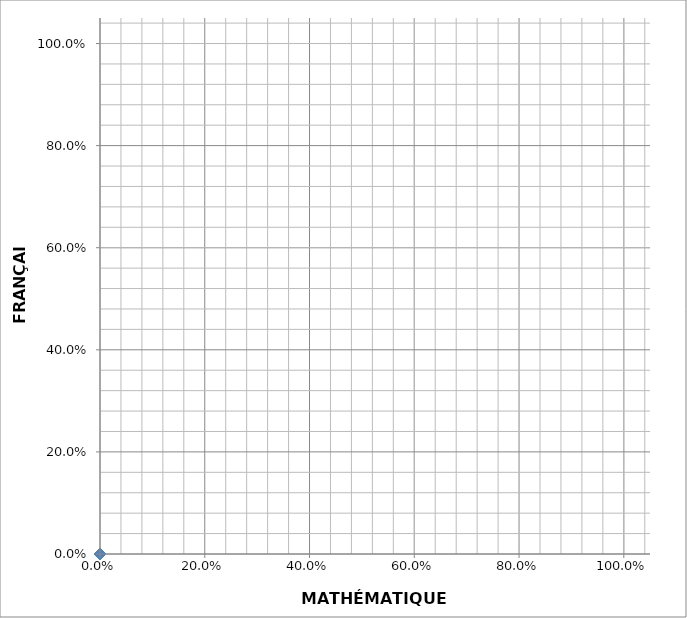
| Category | Series 0 |
|---|---|
| 0.0 | 0 |
| 0.0 | 0 |
| 0.0 | 0 |
| 0.0 | 0 |
| 0.0 | 0 |
| 0.0 | 0 |
| 0.0 | 0 |
| 0.0 | 0 |
| 0.0 | 0 |
| 0.0 | 0 |
| 0.0 | 0 |
| 0.0 | 0 |
| 0.0 | 0 |
| 0.0 | 0 |
| 0.0 | 0 |
| 0.0 | 0 |
| 0.0 | 0 |
| 0.0 | 0 |
| 0.0 | 0 |
| 0.0 | 0 |
| 0.0 | 0 |
| 0.0 | 0 |
| 0.0 | 0 |
| 0.0 | 0 |
| 0.0 | 0 |
| 0.0 | 0 |
| 0.0 | 0 |
| 0.0 | 0 |
| 0.0 | 0 |
| 0.0 | 0 |
| 0.0 | 0 |
| 0.0 | 0 |
| 0.0 | 0 |
| 0.0 | 0 |
| 0.0 | 0 |